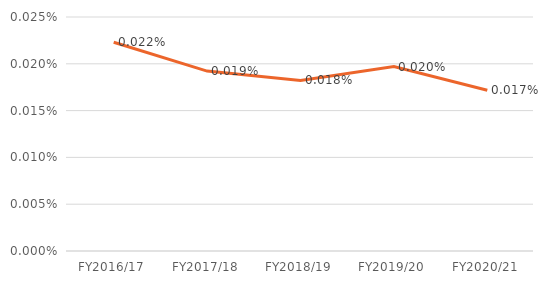
| Category | Series 0 |
|---|---|
| FY2016/17 | 0 |
| FY2017/18 | 0 |
| FY2018/19 | 0 |
| FY2019/20 | 0 |
| FY2020/21 | 0 |